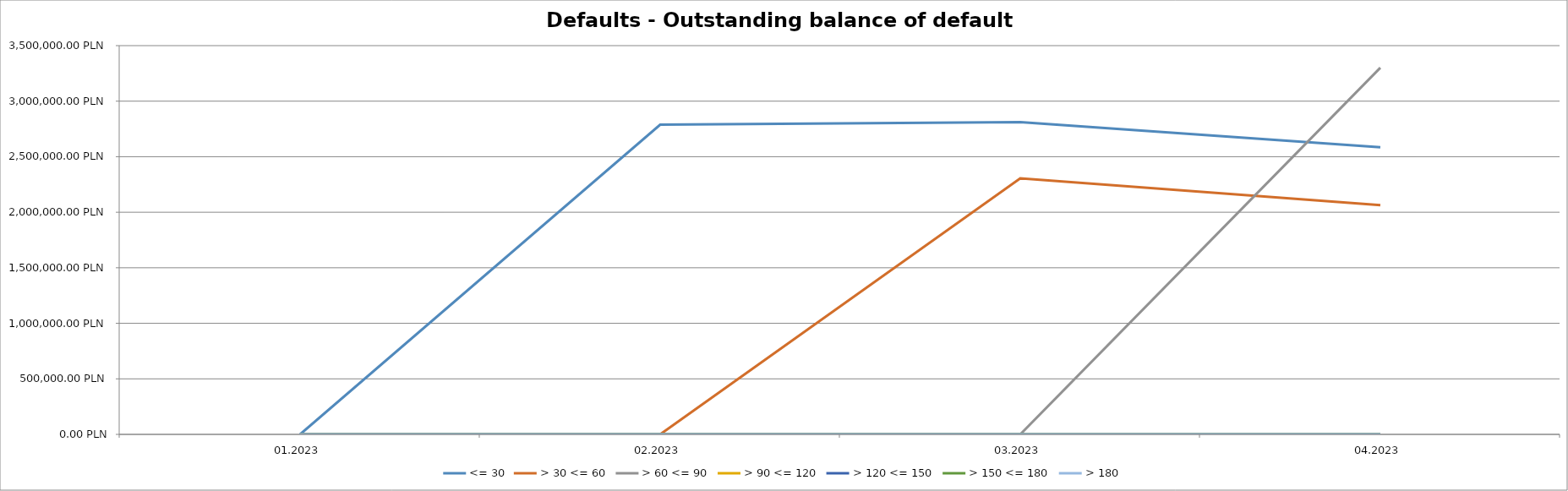
| Category | <= 30 | > 30 <= 60 | > 60 <= 90 | > 90 <= 120 | > 120 <= 150 | > 150 <= 180 | > 180 |
|---|---|---|---|---|---|---|---|
| 01.2023 | 0 | 0 | 0 | 0 | 0 | 0 | 0 |
| 02.2023 | 2788519.82 | 0 | 0 | 0 | 0 | 0 | 0 |
| 03.2023 | 2811517.14 | 2305154.07 | 0 | 0 | 0 | 0 | 0 |
| 04.2023 | 2584791.3 | 2064675.87 | 3301101.31 | 0 | 0 | 0 | 0 |